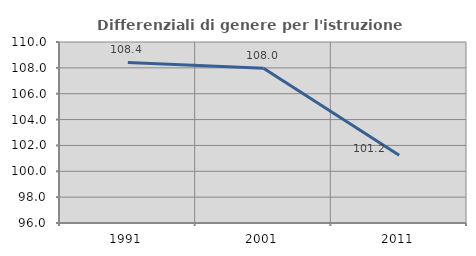
| Category | Differenziali di genere per l'istruzione superiore |
|---|---|
| 1991.0 | 108.42 |
| 2001.0 | 107.961 |
| 2011.0 | 101.238 |